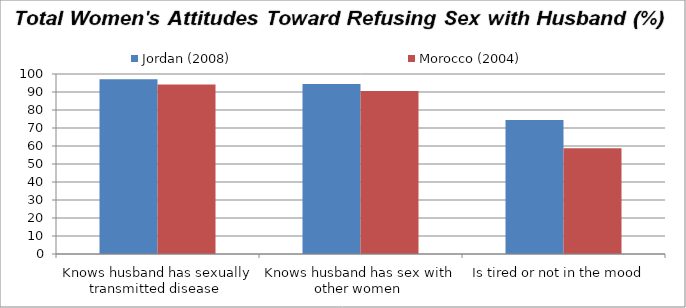
| Category | Jordan (2008) | Morocco (2004) |
|---|---|---|
| Knows husband has sexually transmitted disease  | 97.1 | 94.2 |
| Knows husband has sex with other women  | 94.5 | 90.6 |
| Is tired or not in the mood  | 74.5 | 58.7 |